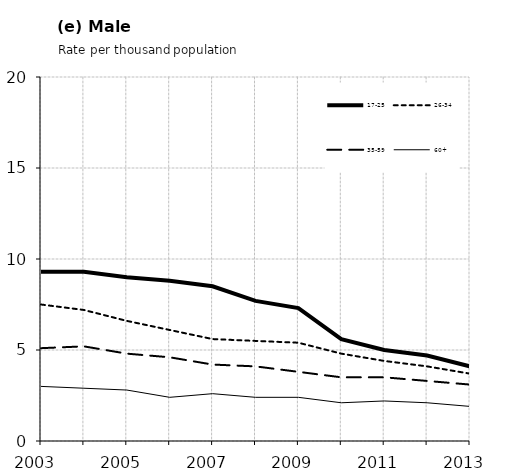
| Category | 17-25 | 26-34 | 35-59 | 60+ |
|---|---|---|---|---|
| 2003.0 | 9.3 | 7.5 | 5.1 | 3 |
| 2004.0 | 9.3 | 7.2 | 5.2 | 2.9 |
| 2005.0 | 9 | 6.6 | 4.8 | 2.8 |
| 2006.0 | 8.8 | 6.1 | 4.6 | 2.4 |
| 2007.0 | 8.5 | 5.6 | 4.2 | 2.6 |
| 2008.0 | 7.7 | 5.5 | 4.1 | 2.4 |
| 2009.0 | 7.3 | 5.4 | 3.8 | 2.4 |
| 2010.0 | 5.6 | 4.8 | 3.5 | 2.1 |
| 2011.0 | 5 | 4.4 | 3.5 | 2.2 |
| 2012.0 | 4.7 | 4.1 | 3.3 | 2.1 |
| 2013.0 | 4.1 | 3.7 | 3.1 | 1.9 |